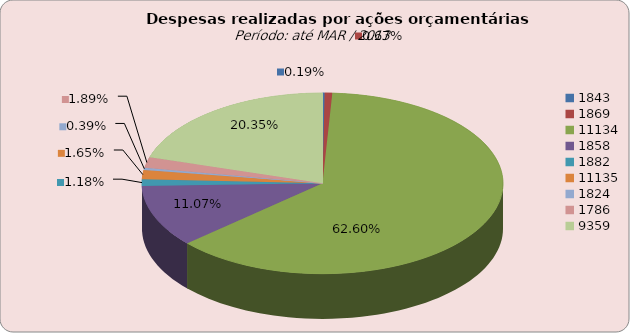
| Category | Series 1 |
|---|---|
| 1843.0 | 81117.02 |
| 1869.0 | 286721.9 |
| 11134.0 | 26656152.8 |
| 1858.0 | 4713037.62 |
| 1882.0 | 503655.42 |
| 11135.0 | 701546.06 |
| 1824.0 | 167411.7 |
| 1786.0 | 804208.43 |
| 9359.0 | 8665136.94 |